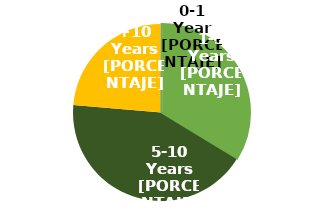
| Category | Series 0 |
|---|---|
| 0-1 Año | 0.001 |
| 1-5 Años | 0.336 |
| 5-10 Años | 0.427 |
| +10 Años | 0.236 |